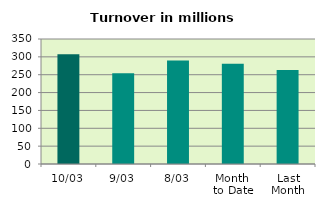
| Category | Series 0 |
|---|---|
| 10/03 | 307.03 |
| 9/03 | 253.871 |
| 8/03 | 289.826 |
| Month 
to Date | 280.597 |
| Last
Month | 263.32 |